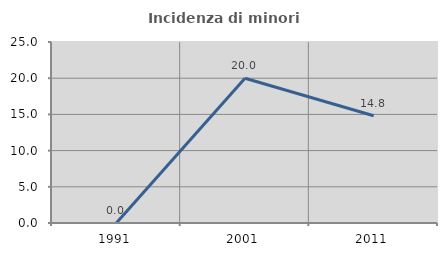
| Category | Incidenza di minori stranieri |
|---|---|
| 1991.0 | 0 |
| 2001.0 | 20 |
| 2011.0 | 14.815 |